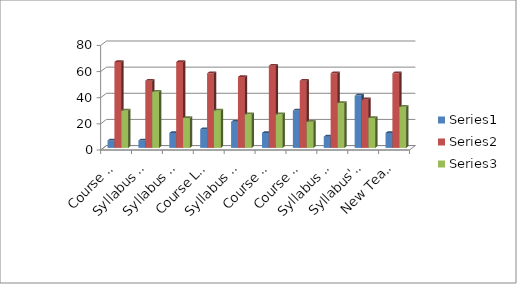
| Category | Series 0 | Series 1 | Series 2 |
|---|---|---|---|
| Course Objectives Clarity | 5.7 | 65.7 | 28.6 |
| Syllabus Organization | 5.7 | 51.4 | 42.9 |
| Syllabus Contents | 11.4 | 65.7 | 22.9 |
| Course Learing Outcomes | 14.3 | 57.1 | 28.6 |
| Syllabus Refernces  | 20 | 54.3 | 25.7 |
| Course Utility | 11.4 | 62.9 | 25.7 |
| Course Optional Papers | 28.6 | 51.4 | 20 |
| Syllabus Teching Compatibility  | 8.6 | 57.1 | 34.3 |
| Syllabus' Improvement Scope | 40 | 37.1 | 22.9 |
| New Teaching Techniques | 11.4 | 57.1 | 31.5 |